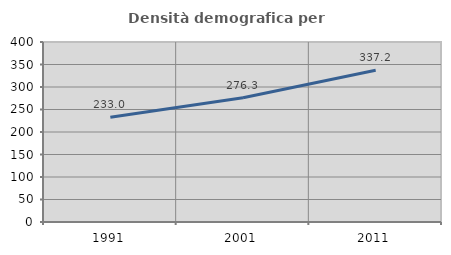
| Category | Densità demografica |
|---|---|
| 1991.0 | 232.971 |
| 2001.0 | 276.277 |
| 2011.0 | 337.229 |